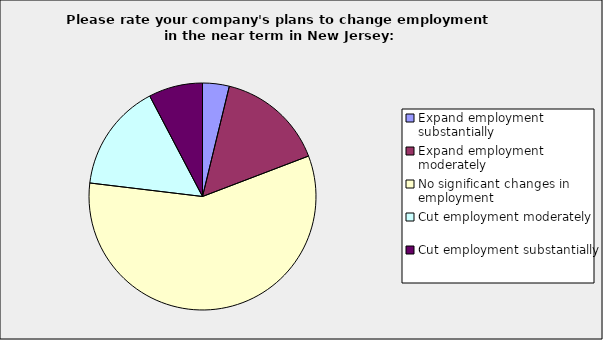
| Category | Series 0 |
|---|---|
| Expand employment substantially | 0.038 |
| Expand employment moderately | 0.154 |
| No significant changes in employment | 0.577 |
| Cut employment moderately | 0.154 |
| Cut employment substantially | 0.077 |